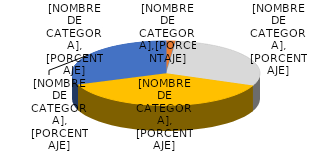
| Category | Series 0 |
|---|---|
| 0 | 96 |
| 1 | 0 |
| 2 | 1691 |
| 3 | 2171 |
| 4 | 1756 |